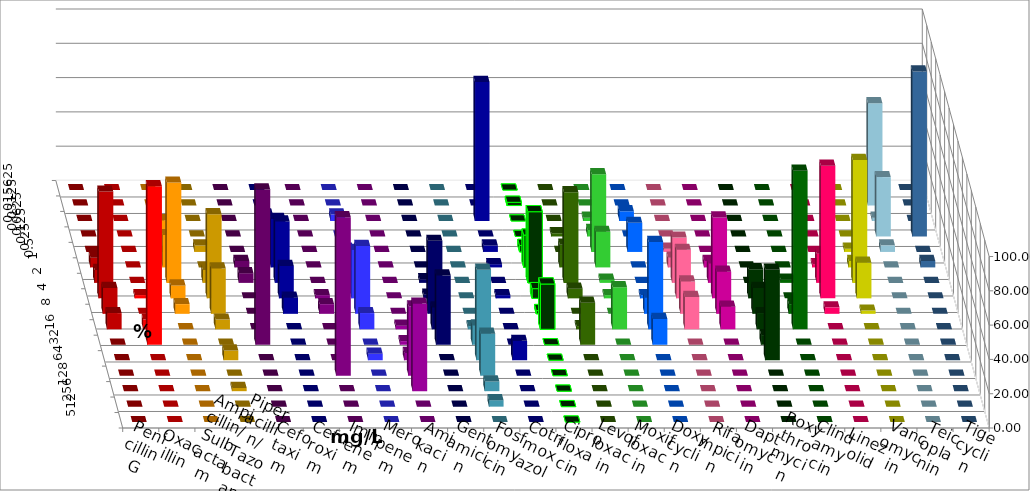
| Category | Penicillin G | Oxacillin | Ampicillin/ Sulbactam | Piperacillin/ Tazobactam | Cefotaxim | Cefuroxim | Imipenem | Meropenem | Amikacin | Gentamicin | Fosfomycin | Cotrimoxazol | Ciprofloxacin | Levofloxacin | Moxifloxacin | Doxycyclin | Rifampicin | Daptomycin | Roxythromycin | Clindamycin | Linezolid | Vancomycin | Teicoplanin | Tigecyclin |
|---|---|---|---|---|---|---|---|---|---|---|---|---|---|---|---|---|---|---|---|---|---|---|---|---|
| 0.015625 | 0 | 0 | 0 | 0 | 0 | 0 | 0 | 0 | 0 | 0 | 0 | 0 | 0 | 0 | 0 | 0 | 0 | 0 | 0 | 0 | 0 | 0 | 0 | 0 |
| 0.03125 | 0 | 0 | 0 | 0 | 0 | 0 | 0 | 0 | 0 | 0 | 0 | 0 | 1.887 | 0 | 0 | 0 | 0 | 0 | 0 | 0 | 0 | 0 | 0 | 59.615 |
| 0.0625 | 0 | 0 | 0 | 0 | 0 | 0 | 3.774 | 3.774 | 0 | 0 | 0 | 81.132 | 0 | 0 | 1.887 | 5.66 | 0 | 0 | 0 | 0 | 0 | 0 | 0 | 1.923 |
| 0.125 | 0 | 0 | 9.434 | 0 | 0 | 0 | 0 | 0 | 0 | 0 | 0 | 0 | 0 | 1.887 | 3.774 | 0 | 0 | 0 | 0 | 0 | 0 | 0 | 96.226 | 34.615 |
| 0.25 | 0 | 0 | 0 | 3.774 | 0 | 0 | 3.774 | 1.887 | 0 | 0 | 0 | 3.774 | 3.774 | 0 | 45.283 | 16.981 | 1.887 | 0 | 0 | 0 | 0 | 1.887 | 0 | 3.846 |
| 0.5 | 5.66 | 0 | 18.868 | 0 | 3.774 | 0 | 28.302 | 9.434 | 0 | 0 | 0 | 1.887 | 18.868 | 13.208 | 20.755 | 0 | 5.66 | 3.774 | 0 | 0 | 1.887 | 3.774 | 3.774 | 0 |
| 1.0 | 7.547 | 0 | 58.491 | 7.547 | 5.66 | 0 | 35.849 | 3.774 | 0 | 2.128 | 0 | 0 | 41.509 | 52.83 | 1.887 | 0 | 26.415 | 11.321 | 0 | 1.887 | 16.981 | 71.698 | 0 | 0 |
| 2.0 | 62.264 | 1.887 | 7.547 | 49.057 | 0 | 1.887 | 18.868 | 28.302 | 0 | 2.128 | 0 | 1.887 | 5.66 | 5.66 | 1.887 | 1.887 | 28.302 | 47.17 | 16.981 | 0 | 77.358 | 20.755 | 0 | 0 |
| 4.0 | 15.094 | 0 | 5.66 | 26.415 | 0 | 5.66 | 9.434 | 39.623 | 0 | 42.553 | 0 | 0 | 1.887 | 0 | 0 | 9.434 | 18.868 | 24.528 | 15.094 | 5.66 | 3.774 | 1.887 | 0 | 0 |
| 8.0 | 9.434 | 5.66 | 0 | 5.66 | 0 | 0 | 0 | 9.434 | 2.128 | 12.766 | 1.887 | 0 | 26.415 | 1.887 | 24.528 | 50.943 | 18.868 | 13.208 | 9.434 | 92.453 | 0 | 0 | 0 | 0 |
| 16.0 | 0 | 92.453 | 0 | 0 | 90.566 | 0 | 0 | 0 | 2.128 | 40.426 | 11.321 | 0 | 0 | 24.528 | 0 | 15.094 | 0 | 0 | 5.66 | 0 | 0 | 0 | 0 | 0 |
| 32.0 | 0 | 0 | 0 | 5.66 | 0 | 0 | 0 | 3.774 | 4.255 | 0 | 52.83 | 11.321 | 0 | 0 | 0 | 0 | 0 | 0 | 52.83 | 0 | 0 | 0 | 0 | 0 |
| 64.0 | 0 | 0 | 0 | 0 | 0 | 92.453 | 0 | 0 | 40.426 | 0 | 24.528 | 0 | 0 | 0 | 0 | 0 | 0 | 0 | 0 | 0 | 0 | 0 | 0 | 0 |
| 128.0 | 0 | 0 | 0 | 1.887 | 0 | 0 | 0 | 0 | 51.064 | 0 | 5.66 | 0 | 0 | 0 | 0 | 0 | 0 | 0 | 0 | 0 | 0 | 0 | 0 | 0 |
| 256.0 | 0 | 0 | 0 | 0 | 0 | 0 | 0 | 0 | 0 | 0 | 3.774 | 0 | 0 | 0 | 0 | 0 | 0 | 0 | 0 | 0 | 0 | 0 | 0 | 0 |
| 512.0 | 0 | 0 | 0 | 0 | 0 | 0 | 0 | 0 | 0 | 0 | 0 | 0 | 0 | 0 | 0 | 0 | 0 | 0 | 0 | 0 | 0 | 0 | 0 | 0 |